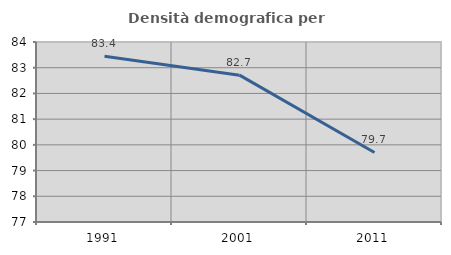
| Category | Densità demografica |
|---|---|
| 1991.0 | 83.445 |
| 2001.0 | 82.71 |
| 2011.0 | 79.704 |